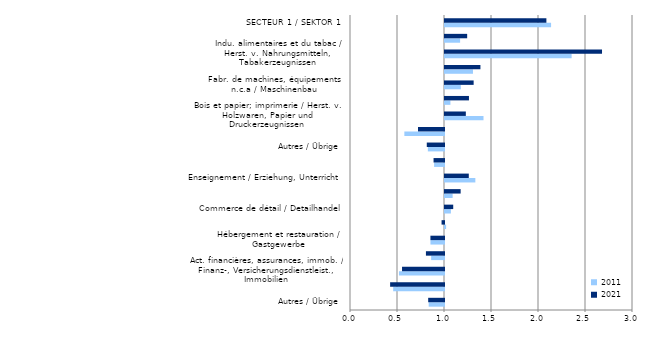
| Category | 2011 | 2021 |
|---|---|---|
| Autres / Übrige | 0.837 | 0.832 |
| Informatique et information / Informationstechnolog., -dienstleistungen | 0.459 | 0.427 |
| Act. financières, assurances, immob. / Finanz-, Versicherungsdienstleist., Immobilien | 0.521 | 0.554 |
| Autres act. spécialisées, scient., tech. / Sonstige freiberufl., wiss., techn. Dienstleist. | 0.863 | 0.808 |
| Hébergement et restauration / Gastgewerbe | 0.856 | 0.855 |
| Santé humaine et action sociale / Gesundheits-, Sozialwesen | 1.012 | 0.974 |
| Commerce de détail / Detailhandel | 1.063 | 1.087 |
| Administration publique / Öffentliche Verwaltung | 1.081 | 1.166 |
| Enseignement / Erziehung, Unterricht | 1.323 | 1.253 |
| SECTEUR 3 / SEKTOR 3 | 0.895 | 0.889 |
| Autres / Übrige | 0.828 | 0.817 |
| Indu. chimique et pharma. / Chemische und pharmazeutische Erzeugnisse | 0.578 | 0.723 |
| Bois et papier; imprimerie / Herst. v. Holzwaren, Papier und Druckerzeugnissen | 1.41 | 1.222 |
| Fabrication de produits métalliques / Herst. v. Metallerzeugnissen | 1.058 | 1.255 |
| Fabr. de machines, équipements n.c.a / Maschinenbau | 1.168 | 1.305 |
| Construction / Baugewerbe | 1.298 | 1.377 |
| Indu. alimentaires et du tabac / Herst. v. Nahrungsmitteln, Tabakerzeugnissen | 2.347 | 2.67 |
| SECTEUR 2 / SEKTOR 2 | 1.161 | 1.236 |
| SECTEUR 1 / SEKTOR 1 | 2.128 | 2.079 |